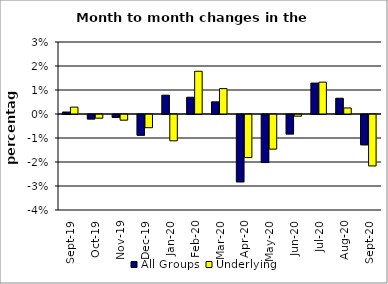
| Category | All Groups | Underlying |
|---|---|---|
| 2019-09-01 | 0.001 | 0.003 |
| 2019-10-01 | -0.002 | -0.002 |
| 2019-11-01 | -0.001 | -0.002 |
| 2019-12-01 | -0.009 | -0.005 |
| 2020-01-01 | 0.008 | -0.011 |
| 2020-02-01 | 0.007 | 0.018 |
| 2020-03-01 | 0.005 | 0.011 |
| 2020-04-01 | -0.028 | -0.018 |
| 2020-05-01 | -0.02 | -0.014 |
| 2020-06-01 | -0.008 | -0.001 |
| 2020-07-01 | 0.013 | 0.013 |
| 2020-08-01 | 0.007 | 0.003 |
| 2020-09-01 | -0.013 | -0.021 |